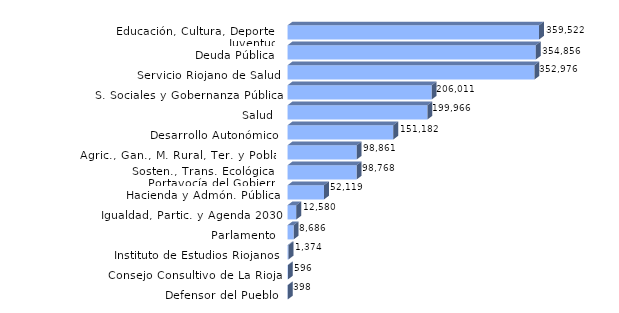
| Category | Series 0 |
|---|---|
| Defensor del Pueblo | 398 |
| Consejo Consultivo de La Rioja | 596 |
| Instituto de Estudios Riojanos | 1374 |
| Parlamento | 8686 |
| Igualdad, Partic. y Agenda 2030 | 12580 |
| Hacienda y Admón. Pública | 52119 |
| Sosten., Trans. Ecológica y Portavocía del Gobierno | 98768 |
| Agric., Gan., M. Rural, Ter. y Poblac. | 98861 |
| Desarrollo Autonómico | 151182 |
| Salud | 199966.43 |
| S. Sociales y Gobernanza Pública | 206010.95 |
| Servicio Riojano de Salud | 352975.55 |
| Deuda Pública | 354855.58 |
| Educación, Cultura, Deporte y Juventud | 359521.77 |